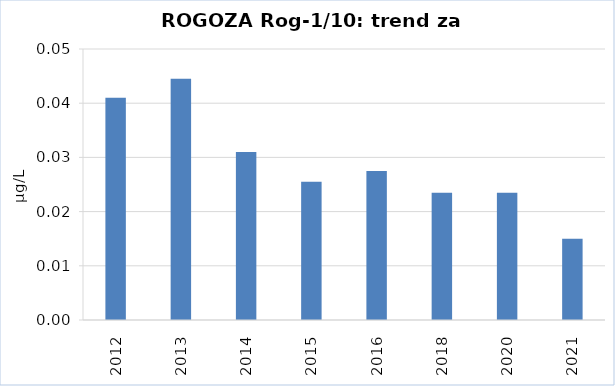
| Category | Vsota |
|---|---|
| 2012 | 0.041 |
| 2013 | 0.044 |
| 2014 | 0.031 |
| 2015 | 0.026 |
| 2016 | 0.028 |
| 2018 | 0.024 |
| 2020 | 0.024 |
| 2021 | 0.015 |